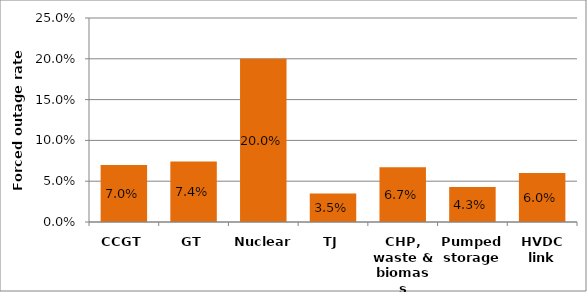
| Category | Series 0 |
|---|---|
| CCGT | 0.07 |
| GT | 0.074 |
| Nuclear | 0.2 |
| TJ | 0.035 |
| CHP, waste & biomass | 0.067 |
| Pumped storage | 0.043 |
| HVDC link | 0.06 |